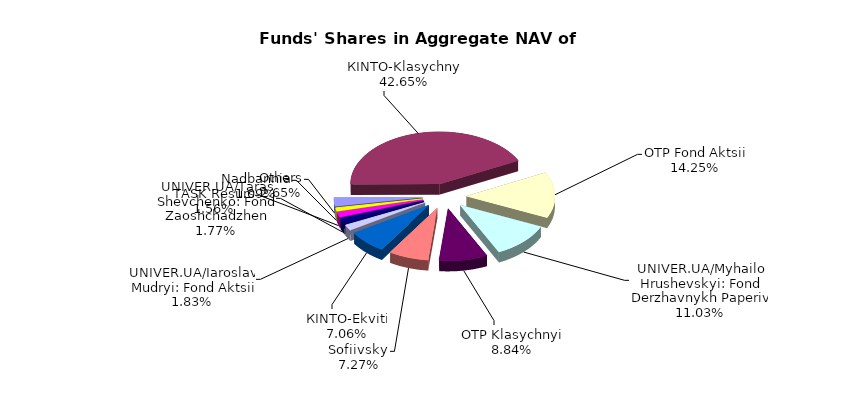
| Category | Series 0 | Series 1 |
|---|---|---|
| Others | 1844417.97 | 0.022 |
| КІNТО-Klasychnyi | 29678661.76 | 0.358 |
| OTP Fond Aktsii | 9913521.12 | 0.119 |
| UNIVER.UA/Myhailo Hrushevskyi: Fond Derzhavnykh Paperiv | 7679095.99 | 0.093 |
| OTP Klasychnyi' | 6149932.36 | 0.074 |
| Sofiivskyi | 5059374.43 | 0.061 |
| КІNTO-Ekviti | 4916076.44 | 0.059 |
| UNIVER.UA/Iaroslav Mudryi: Fond Aktsii | 1273821.2 | 0.015 |
| UNIVER.UA/Taras Shevchenko: Fond Zaoshchadzhen | 1232554.03 | 0.015 |
| ТАSK Resurs | 1084129.98 | 0.013 |
| Nadbannia | 760287.99 | 0.009 |